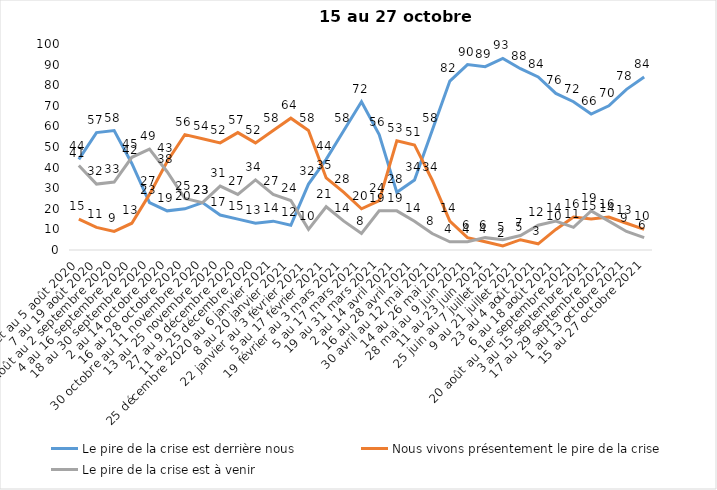
| Category | Le pire de la crise est derrière nous | Nous vivons présentement le pire de la crise | Le pire de la crise est à venir |
|---|---|---|---|
| 24 juillet au 5 août 2020 | 44 | 15 | 41 |
| 7 au 19 août 2020 | 57 | 11 | 32 |
| 21 août au 2 septembre 2020 | 58 | 9 | 33 |
| 4 au 16 septembre 2020 | 42 | 13 | 45 |
| 18 au 30 septembre 2020 | 23 | 27 | 49 |
| 2 au 14 octobre 2020 | 19 | 43 | 38 |
| 16 au 28 octobre 2020 | 20 | 56 | 25 |
| 30 octobre au 11 novembre 2020 | 23 | 54 | 23 |
| 13 au 25 novembre 2020 | 17 | 52 | 31 |
| 27 au 9 décembre 2020 | 15 | 57 | 27 |
| 11 au 25 décembre 2020 | 13 | 52 | 34 |
| 25 décembre 2020 au 6 janvier 2021 | 14 | 58 | 27 |
| 8 au 20 janvier 2021 | 12 | 64 | 24 |
| 22 janvier au 3 février 2021 | 32 | 58 | 10 |
| 5 au 17 février 2021 | 44 | 35 | 21 |
| 19 février au 3 mars 2021 | 58 | 28 | 14 |
| 5 au 17 mars 2021 | 72 | 20 | 8 |
| 19 au 31 mars 2021 | 56 | 24 | 19 |
| 2 au 14 avril 2021 | 28 | 53 | 19 |
| 16 au 28 avril 2021 | 34 | 51 | 14 |
| 30 avril au 12 mai 2021 | 58 | 34 | 8 |
| 14 au 26 mai 2021 | 82 | 14 | 4 |
| 28 mai au 9 juin 2021 | 90 | 6 | 4 |
| 11 au 23 juin 2021 | 89 | 4 | 6 |
| 25 juin au 7 juillet 2021 | 93 | 2 | 5 |
| 9 au 21 juillet 2021 | 88 | 5 | 7 |
| 23 au 4 août 2021 | 84 | 3 | 12 |
| 6 au 18 août 2021 | 76 | 10 | 14 |
| 20 août au 1er septembre 2021 | 72 | 16 | 11 |
| 3 au 15 septembre 2021 | 66 | 15 | 19 |
| 17 au 29 septembre 2021 | 70 | 16 | 14 |
| 1 au 13 octobre 2021 | 78 | 13 | 9 |
| 15 au 27 octobre 2021 | 84 | 10 | 6 |